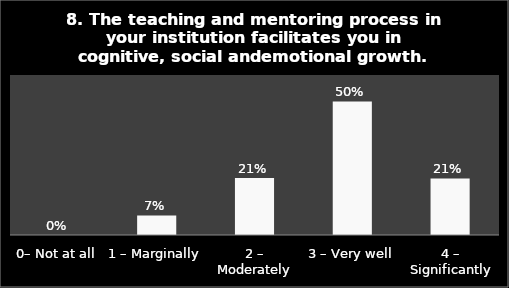
| Category | Series 0 |
|---|---|
| 0– Not at all | 0 |
| 1 – Marginally | 0.073 |
| 2 – Moderately | 0.214 |
| 3 – Very well | 0.501 |
| 4 – Significantly | 0.212 |